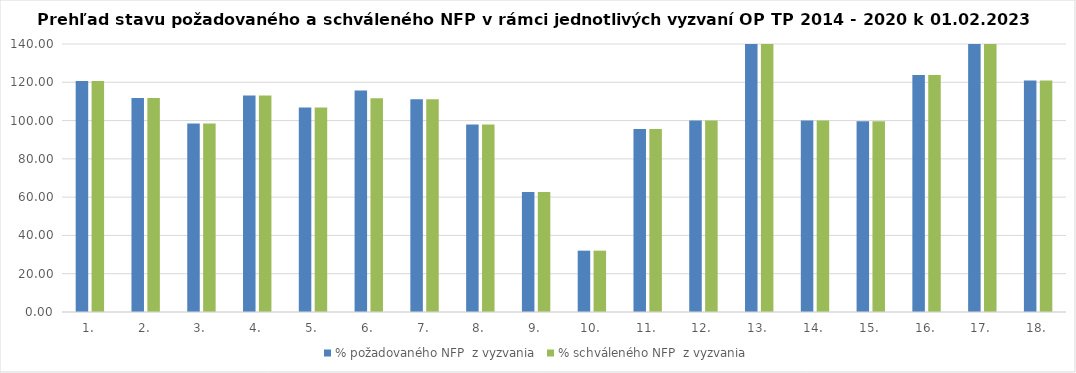
| Category | % požadovaného NFP  z vyzvania | % schváleného NFP  z vyzvania |
|---|---|---|
| 1. | 120.673 | 120.673 |
| 2. | 111.84 | 111.84 |
| 3. | 98.474 | 98.474 |
| 4. | 113.162 | 113.162 |
| 5. | 106.767 | 106.767 |
| 6. | 115.745 | 111.66 |
| 7. | 111.089 | 111.089 |
| 8. | 97.998 | 97.998 |
| 9. | 62.727 | 62.727 |
| 10. | 32.041 | 32.041 |
| 11. | 95.621 | 95.621 |
| 12. | 100.009 | 100.009 |
| 13. | 151.956 | 151.956 |
| 14. | 99.986 | 99.986 |
| 15. | 99.676 | 99.676 |
| 16. | 123.771 | 123.771 |
| 17. | 171.931 | 171.931 |
| 18. | 120.879 | 120.879 |